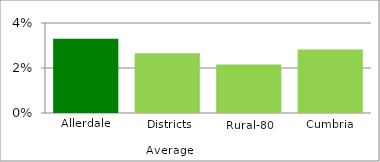
| Category | Series 1 |
|---|---|
| Allerdale | 0.033 |
| Districts Average | 0.027 |
| Rural-80 | 0.022 |
| Cumbria | 0.028 |